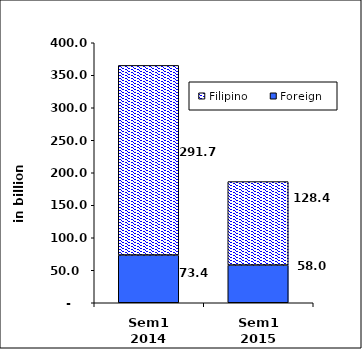
| Category | Foreign | Filipino |
|---|---|---|
| Sem1 2014 | 73.444 | 291.741 |
| Sem1 2015 | 58.027 | 128.416 |